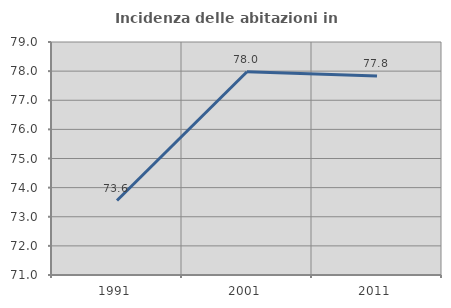
| Category | Incidenza delle abitazioni in proprietà  |
|---|---|
| 1991.0 | 73.557 |
| 2001.0 | 77.981 |
| 2011.0 | 77.829 |